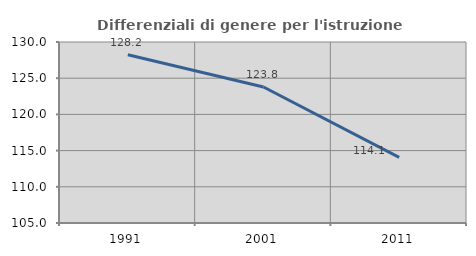
| Category | Differenziali di genere per l'istruzione superiore |
|---|---|
| 1991.0 | 128.237 |
| 2001.0 | 123.78 |
| 2011.0 | 114.057 |